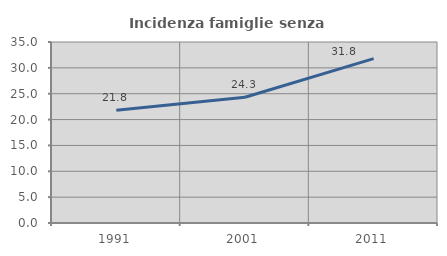
| Category | Incidenza famiglie senza nuclei |
|---|---|
| 1991.0 | 21.822 |
| 2001.0 | 24.311 |
| 2011.0 | 31.792 |